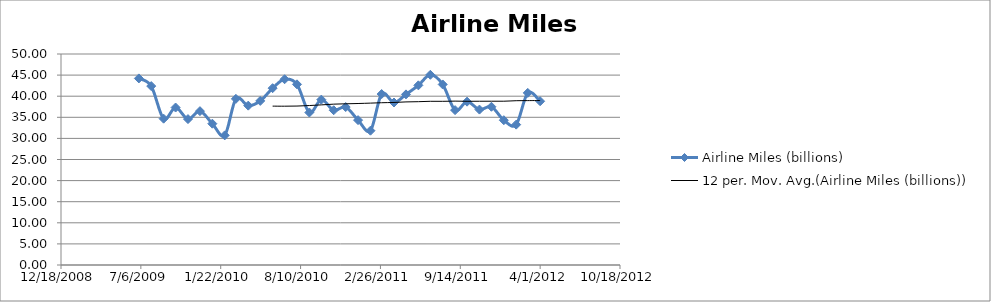
| Category | Airline Miles (billions) |
|---|---|
| 39995.0 | 44.216 |
| 40026.0 | 42.397 |
| 40057.0 | 34.675 |
| 40087.0 | 37.318 |
| 40118.0 | 34.577 |
| 40148.0 | 36.459 |
| 40179.0 | 33.487 |
| 40210.0 | 30.718 |
| 40238.0 | 39.37 |
| 40269.0 | 37.762 |
| 40299.0 | 38.884 |
| 40330.0 | 41.902 |
| 40360.0 | 44.022 |
| 40391.0 | 42.813 |
| 40422.0 | 36.132 |
| 40452.0 | 39.183 |
| 40483.0 | 36.672 |
| 40513.0 | 37.426 |
| 40544.0 | 34.327 |
| 40575.0 | 31.825 |
| 40603.0 | 40.507 |
| 40634.0 | 38.506 |
| 40664.0 | 40.43 |
| 40695.0 | 42.57 |
| 40725.0 | 45.074 |
| 40756.0 | 42.782 |
| 40787.0 | 36.699 |
| 40817.0 | 38.704 |
| 40848.0 | 36.828 |
| 40878.0 | 37.493 |
| 40909.0 | 34.314 |
| 40940.0 | 33.264 |
| 40969.0 | 40.781 |
| 41000.0 | 38.807 |